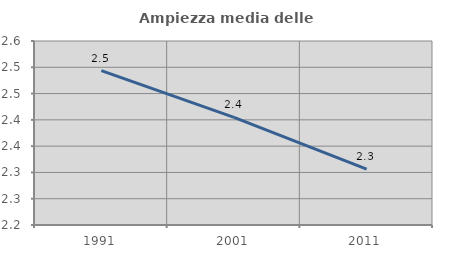
| Category | Ampiezza media delle famiglie |
|---|---|
| 1991.0 | 2.494 |
| 2001.0 | 2.405 |
| 2011.0 | 2.306 |